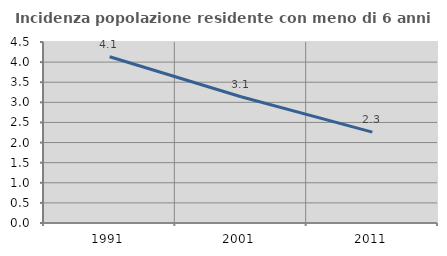
| Category | Incidenza popolazione residente con meno di 6 anni |
|---|---|
| 1991.0 | 4.132 |
| 2001.0 | 3.139 |
| 2011.0 | 2.26 |